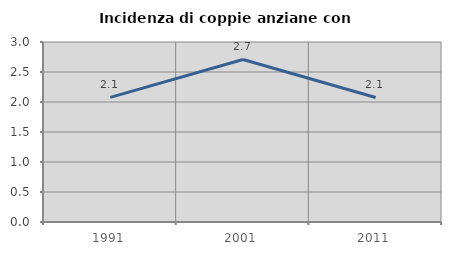
| Category | Incidenza di coppie anziane con figli |
|---|---|
| 1991.0 | 2.077 |
| 2001.0 | 2.709 |
| 2011.0 | 2.076 |